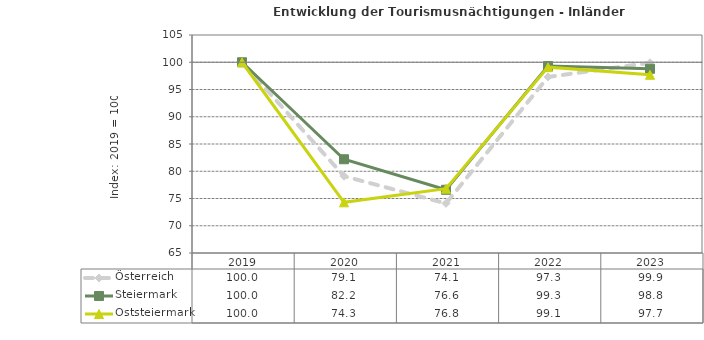
| Category | Österreich | Steiermark | Oststeiermark |
|---|---|---|---|
| 2023.0 | 99.9 | 98.8 | 97.7 |
| 2022.0 | 97.3 | 99.3 | 99.1 |
| 2021.0 | 74.1 | 76.6 | 76.8 |
| 2020.0 | 79.1 | 82.2 | 74.3 |
| 2019.0 | 100 | 100 | 100 |